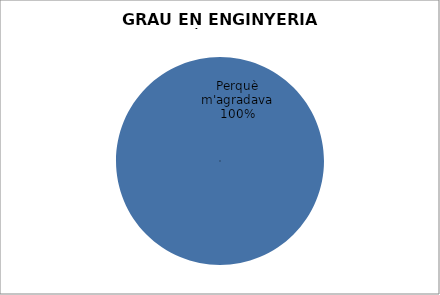
| Category | GRAU EN ENGINYERIA ELÈCTRICA |
|---|---|
| Perquè m'agradava | 4 |
| Bona sortida laboral | 0 |
| S'hi matriculaven les amistats | 0 |
| Nota de tall | 0 |
|  Consells familiars/amistats | 0 |
| Altres | 0 |